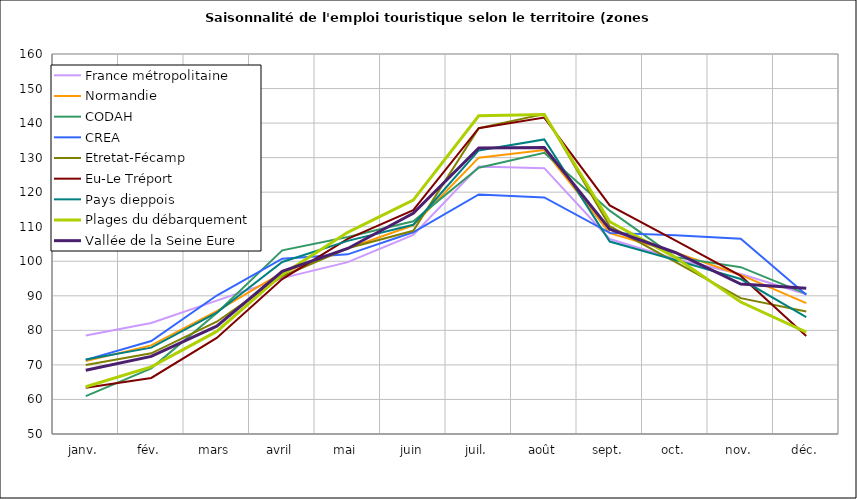
| Category | France métropolitaine | Normandie | CODAH | CREA | Etretat-Fécamp | Eu-Le Tréport | Pays dieppois | Plages du débarquement | Vallée de la Seine Eure |
|---|---|---|---|---|---|---|---|---|---|
| janv. | 78.525 | 71.102 | 60.984 | 71.451 | 69.945 | 63.357 | 71.55 | 63.685 | 68.449 |
| fév. | 82.133 | 75.656 | 69.016 | 76.915 | 73.354 | 66.233 | 74.997 | 69.431 | 72.468 |
| mars | 88.614 | 85.595 | 85.029 | 90.078 | 82.501 | 77.801 | 85.098 | 79.698 | 81.229 |
| avril | 95.123 | 96.677 | 103.171 | 100.737 | 95.669 | 94.835 | 99.807 | 96.193 | 97.079 |
| mai | 99.751 | 103.744 | 107.025 | 102.001 | 103.759 | 106.467 | 105.912 | 108.38 | 103.703 |
| juin | 107.619 | 110.424 | 111.588 | 108.404 | 108.831 | 114.798 | 110.571 | 117.688 | 113.907 |
| juil. | 127.412 | 130 | 127.094 | 119.351 | 138.539 | 138.537 | 132.079 | 142.125 | 132.798 |
| août | 126.959 | 132.194 | 131.42 | 118.474 | 142.603 | 141.585 | 135.261 | 142.512 | 132.937 |
| sept. | 106.435 | 108.115 | 114.654 | 108.219 | 110.16 | 116.172 | 105.702 | 111.451 | 109.302 |
| oct. | 100.656 | 102.578 | 101.19 | 107.558 | 99.836 | 106.06 | 100.358 | 101.138 | 102.537 |
| nov. | 96.321 | 96.046 | 98.288 | 106.512 | 89.333 | 95.756 | 94.858 | 88.212 | 93.405 |
| déc. | 90.453 | 87.868 | 90.542 | 90.299 | 85.47 | 78.398 | 83.808 | 79.488 | 92.186 |